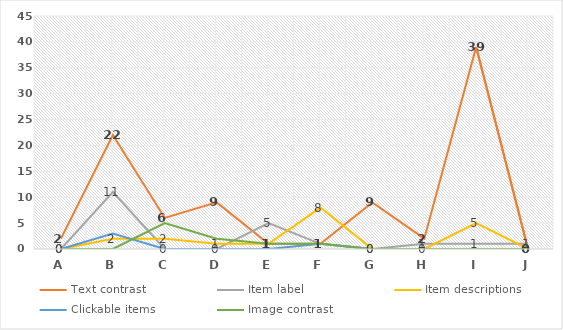
| Category | Text contrast | Item label | Item descriptions | Clickable items | Image contrast |
|---|---|---|---|---|---|
| A | 2 | 0 | 0 | 0 | 0 |
| B | 22 | 11 | 2 | 3 | 0 |
| C | 6 | 0 | 2 | 0 | 5 |
| D | 9 | 0 | 1 | 0 | 2 |
| E | 1 | 5 | 1 | 0 | 1 |
| F | 1 | 1 | 8 | 1 | 1 |
| G | 9 | 0 | 0 | 0 | 0 |
| H | 2 | 1 | 0 | 0 | 0 |
| I | 39 | 1 | 5 | 0 | 0 |
| J | 0 | 1 | 0 | 0 | 0 |